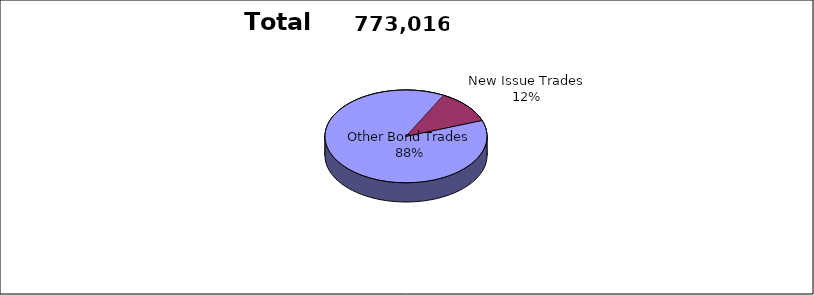
| Category | Series 0 |
|---|---|
| Other Bond Trades | 682136 |
| New Issue Trades | 90880 |